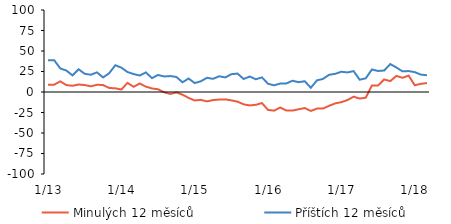
| Category | Minulých 12 měsíců | Příštích 12 měsíců |
|---|---|---|
|  1/13 | 8.92 | 38.82 |
|  2/13 | 8.92 | 38.82 |
|  3/13 | 12.98 | 28.75 |
|  4/13 | 8.4 | 26.12 |
|  5/13 | 7.64 | 20.26 |
|  6/13 | 9.1 | 27.71 |
|  7/13 | 8.51 | 22.2 |
|  8/13 | 6.89 | 21.06 |
|  9/13 | 8.81 | 23.95 |
|  10/13 | 8.54 | 17.76 |
|  11/13 | 4.88 | 22.87 |
|  12/13 | 4.53 | 32.62 |
|  1/14 | 2.99 | 29.64 |
|  2/14 | 11.1 | 24.37 |
|  3/14 | 6.35 | 21.86 |
|  4/14 | 10.34 | 20.09 |
|  5/14 | 6.57 | 23.91 |
|  6/14 | 4.33 | 16.91 |
|  7/14 | 3.35 | 20.75 |
|  8/14 | -0.33 | 18.95 |
|  9/14 | -2.37 | 19.44 |
|  10/14 | -0.5 | 18.32 |
|  11/14 | -3.3 | 11.85 |
|  12/14 | -7.21 | 16.46 |
|  1/15 | -10.32 | 10.88 |
|  2/15 | -9.55 | 13.1 |
|  3/15 | -11.45 | 17.32 |
|  4/15 | -9.85 | 16.04 |
|  5/15 | -9.22 | 19.19 |
|  6/15 | -8.99 | 17.77 |
|  7/15 | -10.2 | 21.74 |
|  8/15 | -11.76 | 22.49 |
|  9/15 | -15.03 | 15.86 |
|  10/15 | -16.38 | 18.89 |
|  11/15 | -15.64 | 15.55 |
|  12/15 | -13.49 | 17.84 |
|  1/16 | -21.91 | 10.03 |
|  2/16 | -22.72 | 8.16 |
|  3/16 | -18.91 | 10.34 |
|  4/16 | -22.65 | 10.48 |
|  5/16 | -22.69 | 13.73 |
|  6/16 | -21.05 | 11.99 |
|  7/16 | -19.56 | 13.15 |
|  8/16 | -23.1 | 5.15 |
|  9/16 | -20.21 | 14.17 |
|  10/16 | -20.19 | 16 |
|  11/16 | -16.81 | 20.99 |
|  12/16 | -13.84 | 22.19 |
|  1/17 | -12.4 | 24.7 |
|  2/17 | -9.79 | 23.87 |
|  3/17 | -5.67 | 25.48 |
|  4/17 | -8.04 | 14.94 |
|  5/17 | -6.9 | 16.78 |
|  6/17 | 7.95 | 27.5 |
|  7/17 | 7.9 | 25.66 |
|  8/17 | 15.28 | 26.2 |
|  9/17 | 13.3 | 34.02 |
|  10/17 | 19.64 | 29.89 |
|  11/17 | 17.29 | 25.16 |
|  12/18 | 20.01 | 25.53 |
|  1/18 | 8.26 | 24.23 |
|  2/18 | 9.94 | 21.21 |
|  3/18 | 10.91 | 20.44 |